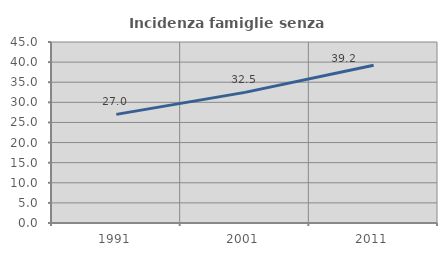
| Category | Incidenza famiglie senza nuclei |
|---|---|
| 1991.0 | 27.006 |
| 2001.0 | 32.48 |
| 2011.0 | 39.198 |